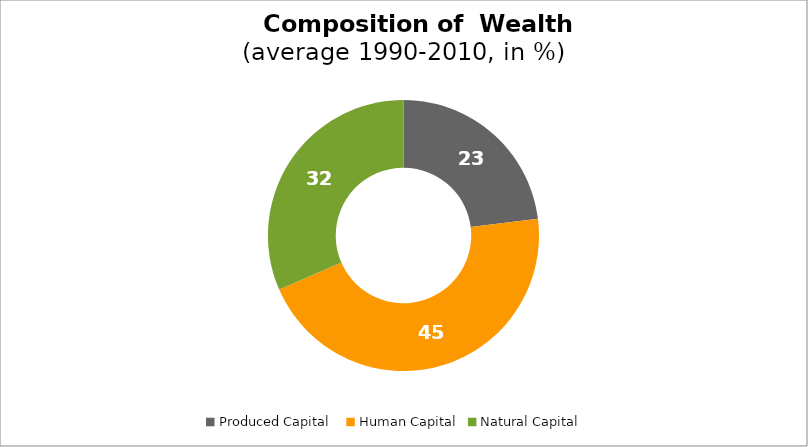
| Category | Series 0 |
|---|---|
| Produced Capital  | 23.017 |
| Human Capital | 45.462 |
| Natural Capital | 31.521 |